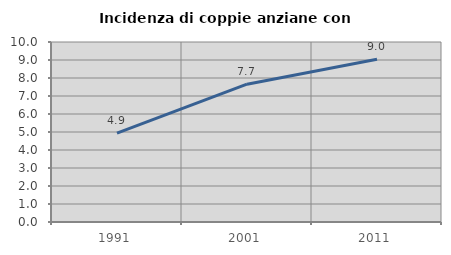
| Category | Incidenza di coppie anziane con figli |
|---|---|
| 1991.0 | 4.94 |
| 2001.0 | 7.656 |
| 2011.0 | 9.046 |